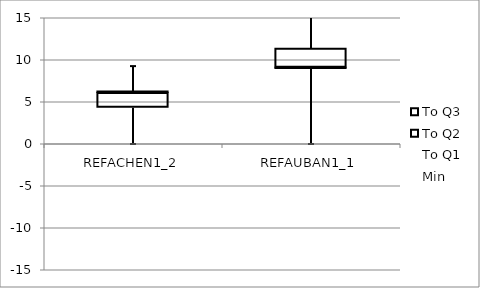
| Category | Min | To Q1 | To Q2 | To Q3 |
|---|---|---|---|---|
| REFACHEN1_2 | -6.237 | 4.305 | 1.766 | 0.166 |
| REFAUBAN1_1 | -9.078 | 8.933 | 0.146 | 2.275 |